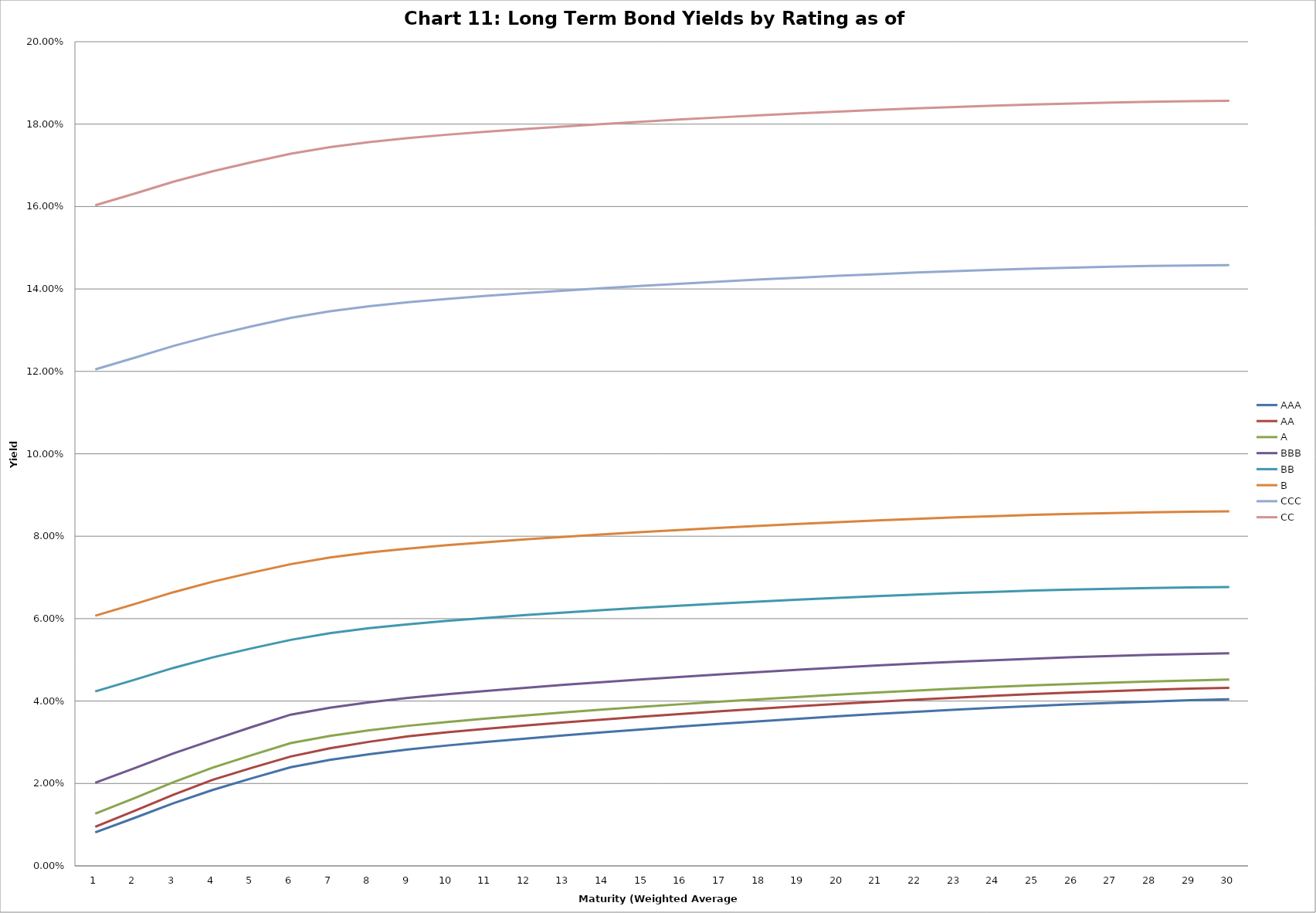
| Category | AAA | AA | A | BBB | BB | B | CCC | CC |
|---|---|---|---|---|---|---|---|---|
| 0 | 0.008 | 0.009 | 0.013 | 0.02 | 0.042 | 0.061 | 0.12 | 0.16 |
| 1 | 0.012 | 0.013 | 0.016 | 0.024 | 0.045 | 0.064 | 0.123 | 0.163 |
| 2 | 0.015 | 0.017 | 0.02 | 0.027 | 0.048 | 0.066 | 0.126 | 0.166 |
| 3 | 0.018 | 0.021 | 0.024 | 0.031 | 0.051 | 0.069 | 0.129 | 0.169 |
| 4 | 0.021 | 0.024 | 0.027 | 0.034 | 0.053 | 0.071 | 0.131 | 0.171 |
| 5 | 0.024 | 0.027 | 0.03 | 0.037 | 0.055 | 0.073 | 0.133 | 0.173 |
| 6 | 0.026 | 0.029 | 0.032 | 0.038 | 0.056 | 0.075 | 0.135 | 0.174 |
| 7 | 0.027 | 0.03 | 0.033 | 0.04 | 0.058 | 0.076 | 0.136 | 0.176 |
| 8 | 0.028 | 0.031 | 0.034 | 0.041 | 0.059 | 0.077 | 0.137 | 0.177 |
| 9 | 0.029 | 0.032 | 0.035 | 0.042 | 0.059 | 0.078 | 0.138 | 0.177 |
| 10 | 0.03 | 0.033 | 0.036 | 0.042 | 0.06 | 0.079 | 0.138 | 0.178 |
| 11 | 0.031 | 0.034 | 0.037 | 0.043 | 0.061 | 0.079 | 0.139 | 0.179 |
| 12 | 0.032 | 0.035 | 0.037 | 0.044 | 0.061 | 0.08 | 0.14 | 0.179 |
| 13 | 0.032 | 0.036 | 0.038 | 0.045 | 0.062 | 0.08 | 0.14 | 0.18 |
| 14 | 0.033 | 0.036 | 0.039 | 0.045 | 0.063 | 0.081 | 0.141 | 0.181 |
| 15 | 0.034 | 0.037 | 0.039 | 0.046 | 0.063 | 0.082 | 0.141 | 0.181 |
| 16 | 0.034 | 0.038 | 0.04 | 0.046 | 0.064 | 0.082 | 0.142 | 0.182 |
| 17 | 0.035 | 0.038 | 0.04 | 0.047 | 0.064 | 0.083 | 0.142 | 0.182 |
| 18 | 0.036 | 0.039 | 0.041 | 0.048 | 0.065 | 0.083 | 0.143 | 0.183 |
| 19 | 0.036 | 0.039 | 0.042 | 0.048 | 0.065 | 0.083 | 0.143 | 0.183 |
| 20 | 0.037 | 0.04 | 0.042 | 0.049 | 0.065 | 0.084 | 0.144 | 0.183 |
| 21 | 0.037 | 0.04 | 0.043 | 0.049 | 0.066 | 0.084 | 0.144 | 0.184 |
| 22 | 0.038 | 0.041 | 0.043 | 0.05 | 0.066 | 0.085 | 0.144 | 0.184 |
| 23 | 0.038 | 0.041 | 0.043 | 0.05 | 0.067 | 0.085 | 0.145 | 0.184 |
| 24 | 0.039 | 0.042 | 0.044 | 0.05 | 0.067 | 0.085 | 0.145 | 0.185 |
| 25 | 0.039 | 0.042 | 0.044 | 0.051 | 0.067 | 0.085 | 0.145 | 0.185 |
| 26 | 0.04 | 0.042 | 0.044 | 0.051 | 0.067 | 0.086 | 0.145 | 0.185 |
| 27 | 0.04 | 0.043 | 0.045 | 0.051 | 0.067 | 0.086 | 0.146 | 0.185 |
| 28 | 0.04 | 0.043 | 0.045 | 0.051 | 0.068 | 0.086 | 0.146 | 0.186 |
| 29 | 0.04 | 0.043 | 0.045 | 0.052 | 0.068 | 0.086 | 0.146 | 0.186 |